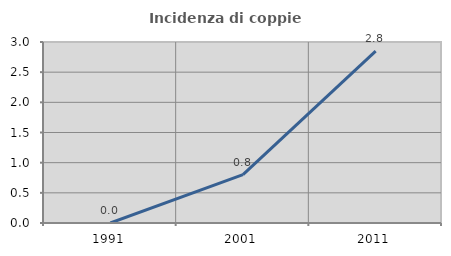
| Category | Incidenza di coppie miste |
|---|---|
| 1991.0 | 0 |
| 2001.0 | 0.802 |
| 2011.0 | 2.85 |